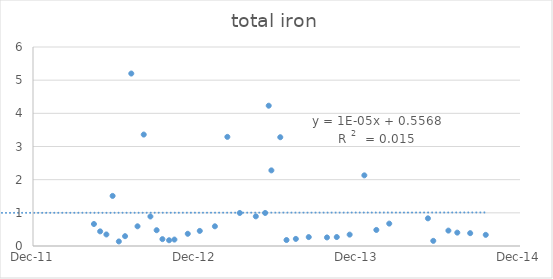
| Category | Series 0 |
|---|---|
| 41017.0 | 0.663 |
| 41031.0 | 0.441 |
| 41045.0 | 0.348 |
| 41059.0 | 1.51 |
| 41073.0 | 0.137 |
| 41087.0 | 0.296 |
| 41101.0 | 5.2 |
| 41115.0 | 0.594 |
| 41129.0 | 3.36 |
| 41144.0 | 0.89 |
| 41158.0 | 0.476 |
| 41171.0 | 0.207 |
| 41186.0 | 0.173 |
| 41198.0 | 0.194 |
| 41228.0 | 0.368 |
| 41255.0 | 0.455 |
| 41289.0 | 0.594 |
| 41317.0 | 3.29 |
| 41345.0 | 0.996 |
| 41381.0 | 0.894 |
| 41402.0 | 0.996 |
| 41410.0 | 4.23 |
| 41416.0 | 2.28 |
| 41436.0 | 3.28 |
| 41450.0 | 0.18 |
| 41471.0 | 0.214 |
| 41500.0 | 0.269 |
| 41541.0 | 0.258 |
| 41563.0 | 0.27 |
| 41592.0 | 0.343 |
| 41625.0 | 2.13 |
| 41652.0 | 0.484 |
| 41681.0 | 0.675 |
| 41768.0 | 0.834 |
| 41780.0 | 0.155 |
| 41814.0 | 0.464 |
| 41834.0 | 0.403 |
| 41863.0 | 0.387 |
| 41898.0 | 0.336 |